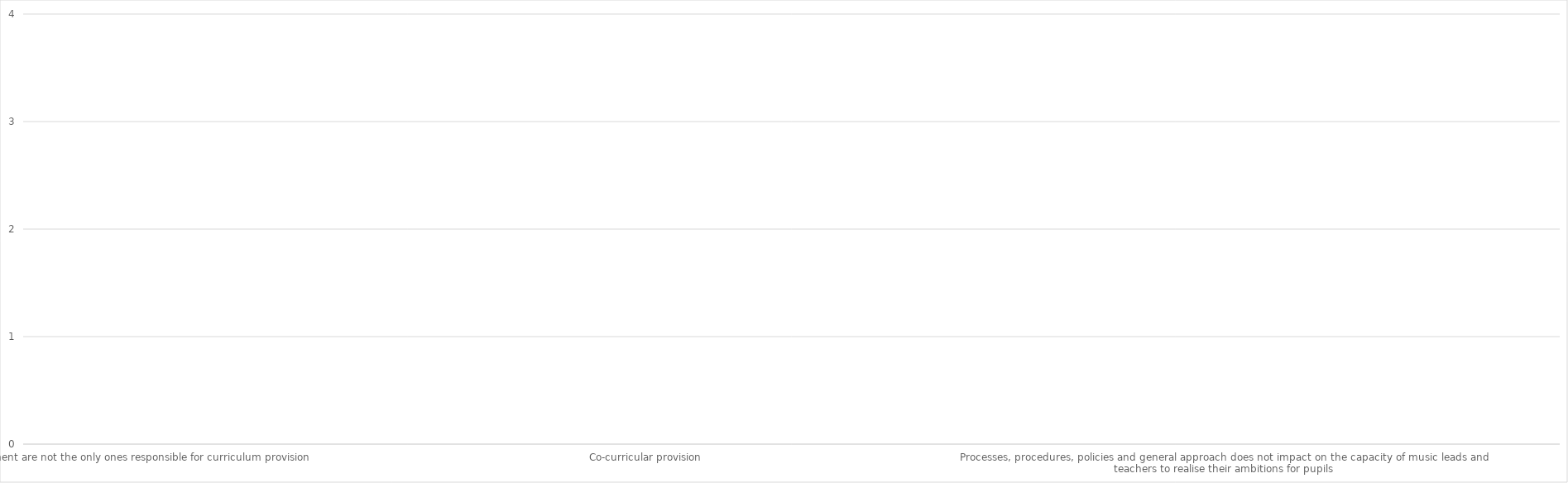
| Category | Series 0 |
|---|---|
| Music leads and heads of department are not the only ones responsible for curriculum provision | 0 |
| Projects the place/role of music in school | 0 |
| Understands music as a curriculum area | 0 |
| Understands extra, and co-curricular music | 0 |
| Understands music assessment frameworks | 0 |
| Developing the musical culture of the school | 0 |
| Co-curricular provision | 0 |
| Experiences | 0 |
| Performances | 0 |
| Consideration is given to what this means for the time classroom staff are afforded for being a music lead | 0 |
| Supporting staff by funding visiting music tutors (through support from their Music Hub or inviting professional musicians into school to deliver a breadth of co-curricular opportunities) | 0 |
| Help is offered to music leads to deliver quality provision  | 0 |
| Processes, procedures, policies and general approach does not impact on the capacity of music leads and teachers to realise their ambitions for pupils | 0 |
| Aware of how music fits into the curriculum, co-curricular and enrichment provision  | 0 |
| How the trust/school ensures the quality of the music offer | 0 |
| The quality of the music provision is supported by the Music Development Plan(s), which could, as outlined above, be linked to the overarching School Improvement Plan(s) | 0 |